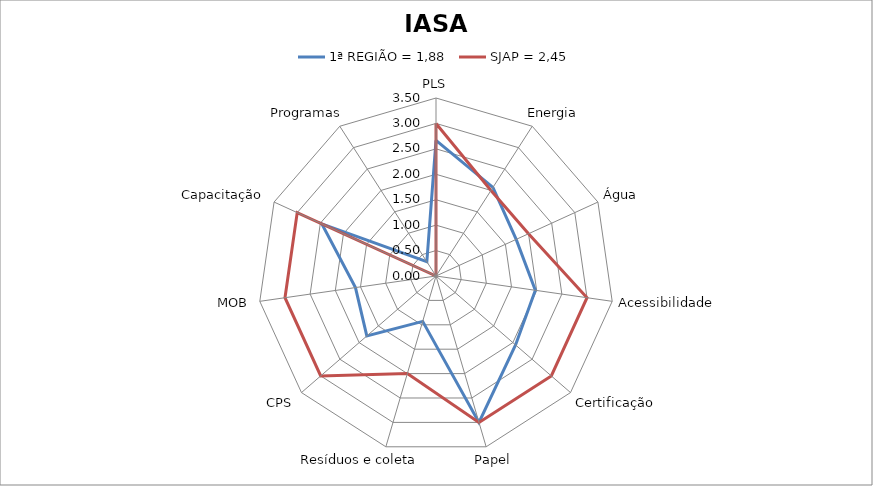
| Category | 1ª REGIÃO = 1,88 | SJAP = 2,45 |
|---|---|---|
| PLS | 2.667 | 3 |
| Energia | 2.07 | 2 |
| Água | 1.733 | 2 |
| Acessibilidade | 1.973 | 3 |
| Certificação | 2.07 | 3 |
| Papel | 3 | 3 |
| Resíduos e coleta | 0.93 | 2 |
| CPS | 1.8 | 3 |
| MOB | 1.6 | 3 |
| Capacitação | 2.467 | 3 |
| Programas | 0.333 | 0 |